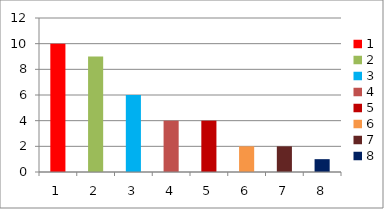
| Category | Series 0 |
|---|---|
| 0 | 10 |
| 1 | 9 |
| 2 | 6 |
| 3 | 4 |
| 4 | 4 |
| 5 | 2 |
| 6 | 2 |
| 7 | 1 |